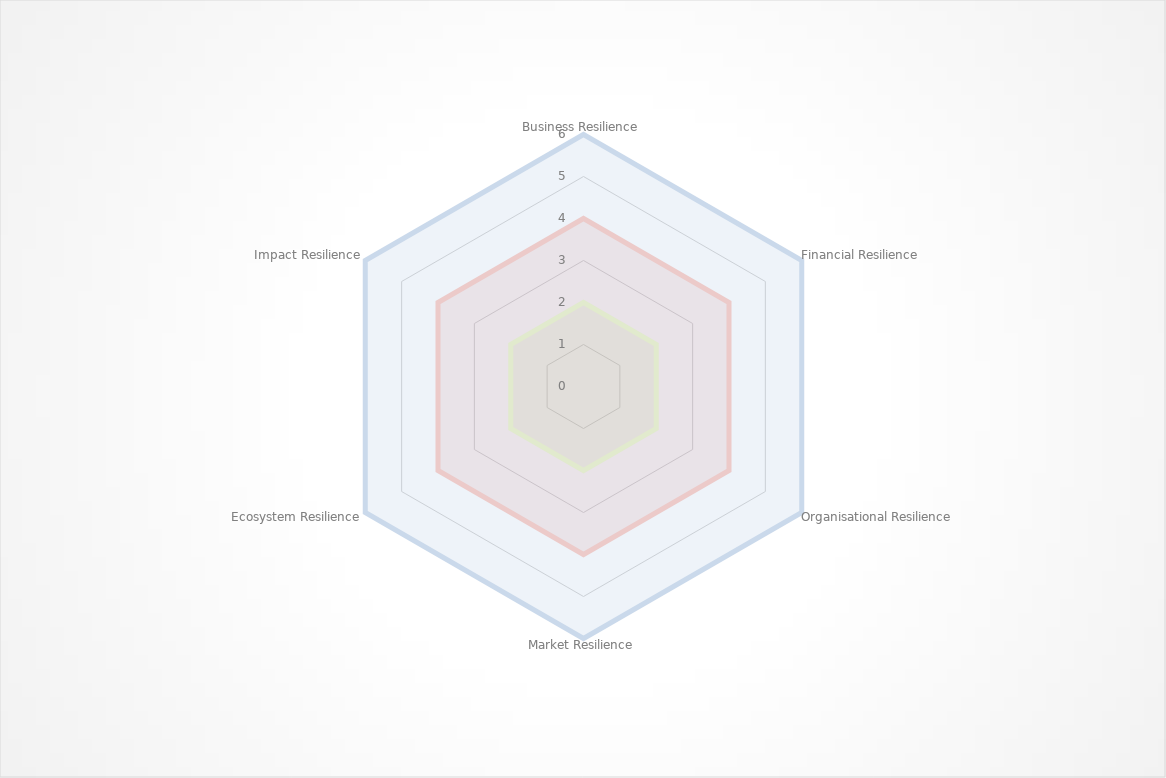
| Category | Series 0 | Series 1 | Series 2 | Series 3 | Self-assessment |
|---|---|---|---|---|---|
| Business Resilience | 6 | 4 | 2 | 0 | 0 |
| Financial Resilience | 6 | 4 | 2 | 0 | 0 |
| Organisational Resilience | 6 | 4 | 2 | 0 | 0 |
| Market Resilience | 6 | 4 | 2 | 0 | 0 |
| Ecosystem Resilience | 6 | 4 | 2 | 0 | 0 |
| Impact Resilience | 6 | 4 | 2 | 0 | 0 |